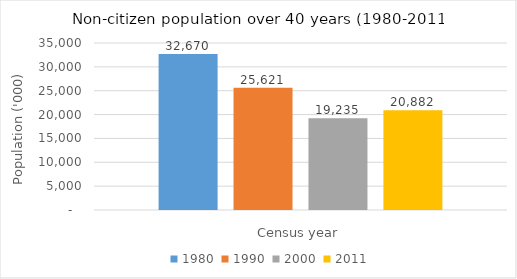
| Category | 1980 | 1990 | 2000 | 2011 |
|---|---|---|---|---|
| 0 | 32670 | 25621 | 19235 | 20882 |